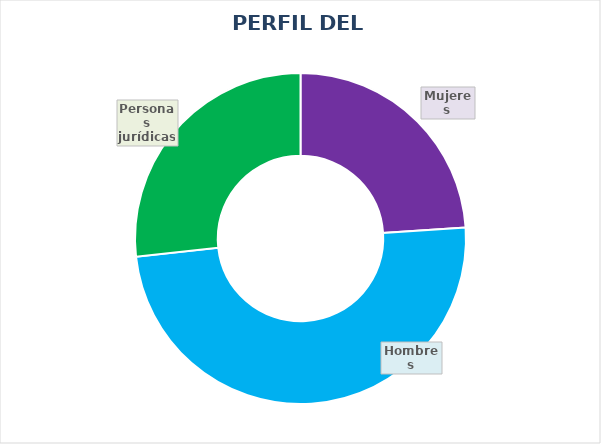
| Category | PORCENTAJE |
|---|---|
| Mujeres | 0.239 |
| Hombres | 0.493 |
| Personas jurídicas | 0.268 |